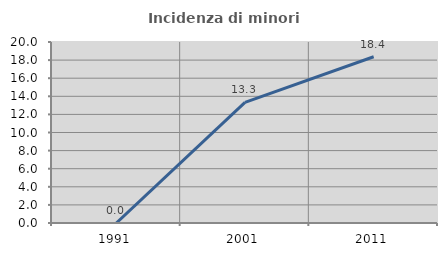
| Category | Incidenza di minori stranieri |
|---|---|
| 1991.0 | 0 |
| 2001.0 | 13.333 |
| 2011.0 | 18.367 |